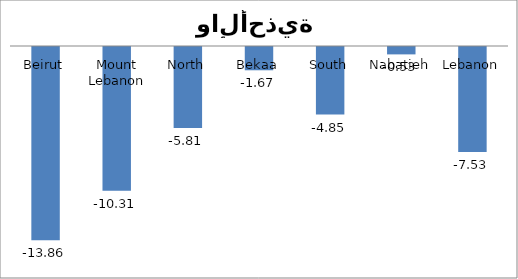
| Category | Series 0 |
|---|---|
| Beirut | -13.86 |
| Mount Lebanon | -10.31 |
| North | -5.81 |
| Bekaa | -1.67 |
| South | -4.85 |
| Nabatieh | -0.53 |
| Lebanon | -7.53 |